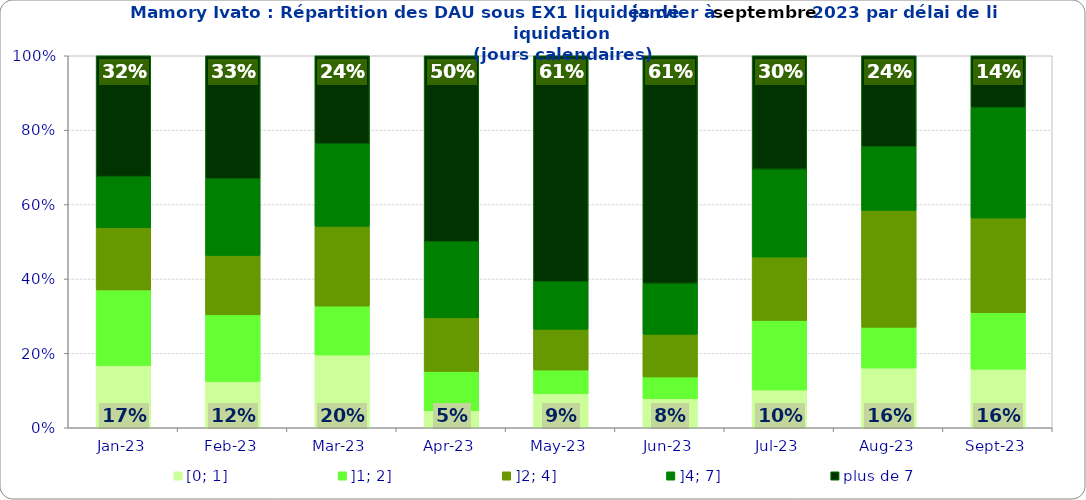
| Category | [0; 1] | ]1; 2] | ]2; 4] | ]4; 7] | plus de 7 |
|---|---|---|---|---|---|
| 2023-01-01 | 0.168 | 0.203 | 0.168 | 0.137 | 0.325 |
| 2023-02-01 | 0.125 | 0.179 | 0.16 | 0.206 | 0.331 |
| 2023-03-01 | 0.195 | 0.132 | 0.214 | 0.222 | 0.237 |
| 2023-04-01 | 0.045 | 0.106 | 0.144 | 0.205 | 0.5 |
| 2023-05-01 | 0.091 | 0.064 | 0.11 | 0.128 | 0.607 |
| 2023-06-01 | 0.078 | 0.059 | 0.115 | 0.137 | 0.612 |
| 2023-07-01 | 0.102 | 0.187 | 0.17 | 0.236 | 0.305 |
| 2023-08-01 | 0.161 | 0.109 | 0.314 | 0.172 | 0.245 |
| 2023-09-01 | 0.158 | 0.152 | 0.255 | 0.297 | 0.139 |